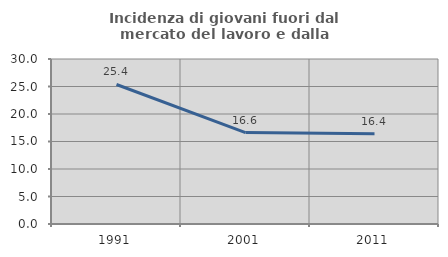
| Category | Incidenza di giovani fuori dal mercato del lavoro e dalla formazione  |
|---|---|
| 1991.0 | 25.366 |
| 2001.0 | 16.629 |
| 2011.0 | 16.432 |